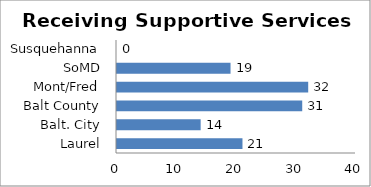
| Category | Receiving Supportive Services |
|---|---|
| Laurel | 21 |
| Balt. City | 14 |
| Balt County | 31 |
| Mont/Fred | 32 |
| SoMD | 19 |
| Susquehanna | 0 |